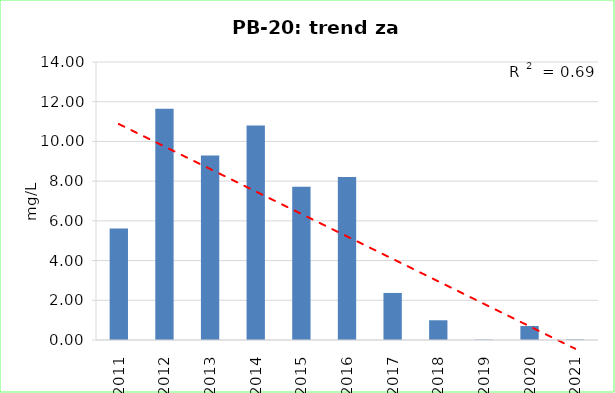
| Category | Vsota |
|---|---|
| 2011 | 5.615 |
| 2012 | 11.65 |
| 2013 | 9.29 |
| 2014 | 10.8 |
| 2015 | 7.72 |
| 2016 | 8.21 |
| 2017 | 2.37 |
| 2018 | 0.993 |
| 2019 | 0.018 |
| 2020 | 0.703 |
| 2021 | 0.028 |